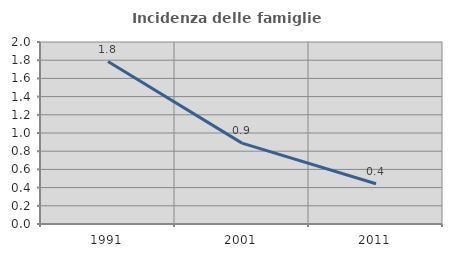
| Category | Incidenza delle famiglie numerose |
|---|---|
| 1991.0 | 1.786 |
| 2001.0 | 0.889 |
| 2011.0 | 0.442 |